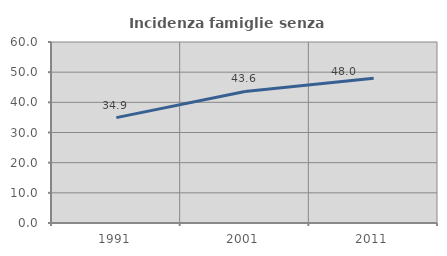
| Category | Incidenza famiglie senza nuclei |
|---|---|
| 1991.0 | 34.94 |
| 2001.0 | 43.605 |
| 2011.0 | 48 |